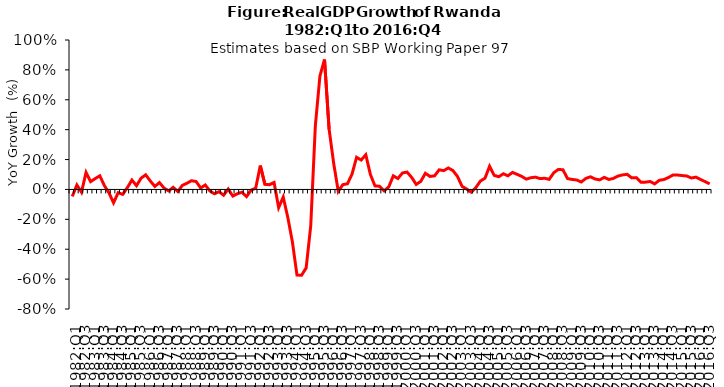
| Category | Series 0 |
|---|---|
| 1982:Q1 | -0.047 |
| 1982:Q2 | 0.03 |
| 1982:Q3 | -0.019 |
| 1982:Q4 | 0.113 |
| 1983:Q1 | 0.052 |
| 1983:Q2 | 0.073 |
| 1983:Q3 | 0.091 |
| 1983:Q4 | 0.026 |
| 1984:Q1 | -0.023 |
| 1984:Q2 | -0.089 |
| 1984:Q3 | -0.022 |
| 1984:Q4 | -0.033 |
| 1985:Q1 | 0.012 |
| 1985:Q2 | 0.063 |
| 1985:Q3 | 0.025 |
| 1985:Q4 | 0.075 |
| 1986:Q1 | 0.098 |
| 1986:Q2 | 0.057 |
| 1986:Q3 | 0.02 |
| 1986:Q4 | 0.046 |
| 1987:Q1 | 0.01 |
| 1987:Q2 | -0.01 |
| 1987:Q3 | 0.014 |
| 1987:Q4 | -0.014 |
| 1988:Q1 | 0.027 |
| 1988:Q2 | 0.041 |
| 1988:Q3 | 0.058 |
| 1988:Q4 | 0.053 |
| 1989:Q1 | 0.01 |
| 1989:Q2 | 0.03 |
| 1989:Q3 | -0.01 |
| 1989:Q4 | -0.029 |
| 1990:Q1 | -0.015 |
| 1990:Q2 | -0.039 |
| 1990:Q3 | 0.003 |
| 1990:Q4 | -0.044 |
| 1991:Q1 | -0.029 |
| 1991:Q2 | -0.019 |
| 1991:Q3 | -0.048 |
| 1991:Q4 | -0.005 |
| 1992:Q1 | 0.009 |
| 1992:Q2 | 0.16 |
| 1992:Q3 | 0.034 |
| 1992:Q4 | 0.032 |
| 1993:Q1 | 0.046 |
| 1993:Q2 | -0.122 |
| 1993:Q3 | -0.051 |
| 1993:Q4 | -0.187 |
| 1994:Q1 | -0.351 |
| 1994:Q2 | -0.573 |
| 1994:Q3 | -0.574 |
| 1994:Q4 | -0.525 |
| 1995:Q1 | -0.242 |
| 1995:Q2 | 0.425 |
| 1995:Q3 | 0.758 |
| 1995:Q4 | 0.869 |
| 1996:Q1 | 0.404 |
| 1996:Q2 | 0.175 |
| 1996:Q3 | -0.013 |
| 1996:Q4 | 0.032 |
| 1997:Q1 | 0.038 |
| 1997:Q2 | 0.102 |
| 1997:Q3 | 0.215 |
| 1997:Q4 | 0.197 |
| 1998:Q1 | 0.232 |
| 1998:Q2 | 0.101 |
| 1998:Q3 | 0.024 |
| 1998:Q4 | 0.021 |
| 1999:Q1 | -0.009 |
| 1999:Q2 | 0.017 |
| 1999:Q3 | 0.091 |
| 1999:Q4 | 0.073 |
| 2000:Q1 | 0.11 |
| 2000:Q2 | 0.116 |
| 2000:Q3 | 0.081 |
| 2000:Q4 | 0.033 |
| 2001:Q1 | 0.054 |
| 2001:Q2 | 0.108 |
| 2001:Q3 | 0.087 |
| 2001:Q4 | 0.091 |
| 2002:Q1 | 0.131 |
| 2002:Q2 | 0.126 |
| 2002:Q3 | 0.144 |
| 2002:Q4 | 0.127 |
| 2003:Q1 | 0.087 |
| 2003:Q2 | 0.02 |
| 2003:Q3 | 0.003 |
| 2003:Q4 | -0.018 |
| 2004:Q1 | 0.012 |
| 2004:Q2 | 0.056 |
| 2004:Q3 | 0.076 |
| 2004:Q4 | 0.155 |
| 2005:Q1 | 0.094 |
| 2005:Q2 | 0.085 |
| 2005:Q3 | 0.105 |
| 2005:Q4 | 0.091 |
| 2006:Q1 | 0.114 |
| 2006:Q2 | 0.101 |
| 2006:Q3 | 0.087 |
| 2006:Q4 | 0.069 |
| 2007:Q1 | 0.078 |
| 2007:Q2 | 0.082 |
| 2007:Q3 | 0.072 |
| 2007:Q4 | 0.075 |
| 2008:Q1 | 0.068 |
| 2008:Q2 | 0.112 |
| 2008:Q3 | 0.134 |
| 2008:Q4 | 0.131 |
| 2009:Q1 | 0.073 |
| 2009:Q2 | 0.067 |
| 2009:Q3 | 0.063 |
| 2009:Q4 | 0.05 |
| 2010:Q1 | 0.074 |
| 2010:Q2 | 0.084 |
| 2010:Q3 | 0.07 |
| 2010:Q4 | 0.064 |
| 2011:Q1 | 0.081 |
| 2011:Q2 | 0.067 |
| 2011:Q3 | 0.074 |
| 2011:Q4 | 0.09 |
| 2012:Q1 | 0.097 |
| 2012:Q2 | 0.101 |
| 2012:Q3 | 0.077 |
| 2012:Q4 | 0.079 |
| 2013:Q1 | 0.049 |
| 2013:Q2 | 0.049 |
| 2013:Q3 | 0.053 |
| 2013:Q4 | 0.037 |
| 2014:Q1 | 0.061 |
| 2014:Q2 | 0.066 |
| 2014:Q3 | 0.08 |
| 2014:Q4 | 0.097 |
| 2015:Q1 | 0.096 |
| 2015:Q2 | 0.093 |
| 2015:Q3 | 0.09 |
| 2015:Q4 | 0.076 |
| 2016:Q1 | 0.082 |
| 2016:Q2 | 0.067 |
| 2016:Q3 | 0.052 |
| 2016:Q4 | 0.037 |